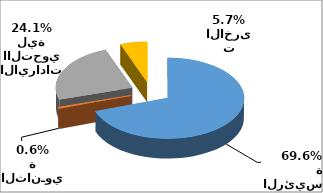
| Category | Series 0 |
|---|---|
| الايرادات الرئيسة | 8274134695 |
| الايـرادات الثانـوية | 69179057 |
| الايرادات االتحويلية | 2863149271 |
| الايرادات الاخرى | 676455075 |